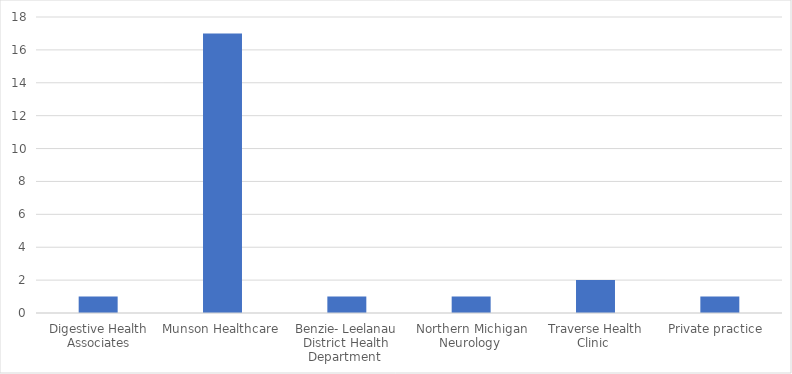
| Category | Number of Responses |
|---|---|
| Digestive Health Associates | 1 |
| Munson Healthcare | 17 |
| Benzie- Leelanau District Health Department  | 1 |
| Northern Michigan Neurology  | 1 |
| Traverse Health Clinic  | 2 |
| Private practice  | 1 |